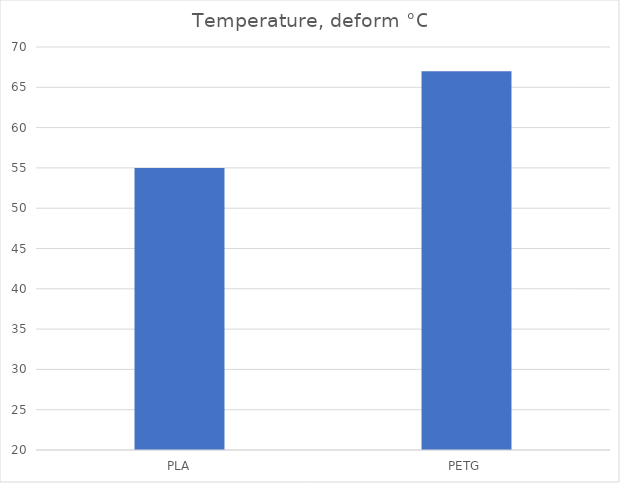
| Category | Deform °C |
|---|---|
| PLA | 55 |
| PETG | 67 |